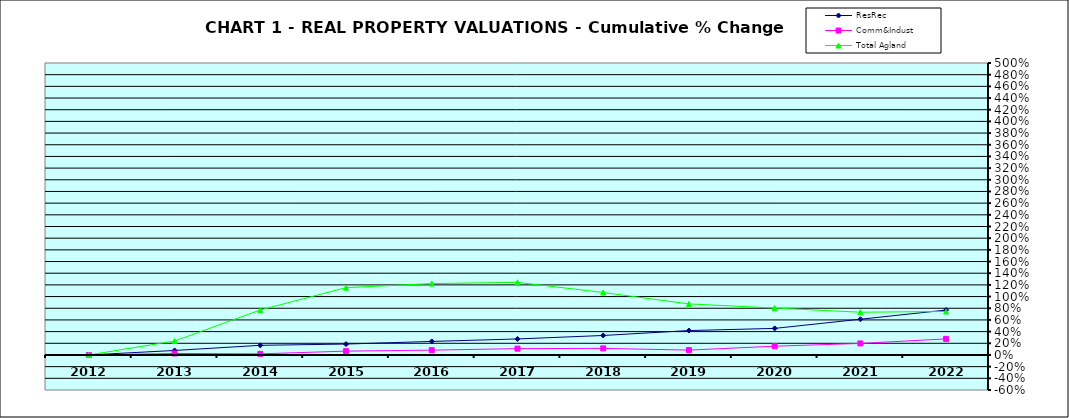
| Category | ResRec | Comm&Indust | Total Agland |
|---|---|---|---|
| 2012.0 | 0 | 0 | 0 |
| 2013.0 | 0.077 | 0.025 | 0.238 |
| 2014.0 | 0.165 | 0.019 | 0.77 |
| 2015.0 | 0.187 | 0.066 | 1.153 |
| 2016.0 | 0.232 | 0.083 | 1.222 |
| 2017.0 | 0.274 | 0.108 | 1.243 |
| 2018.0 | 0.334 | 0.113 | 1.07 |
| 2019.0 | 0.418 | 0.083 | 0.874 |
| 2020.0 | 0.455 | 0.15 | 0.804 |
| 2021.0 | 0.612 | 0.198 | 0.732 |
| 2022.0 | 0.769 | 0.275 | 0.745 |